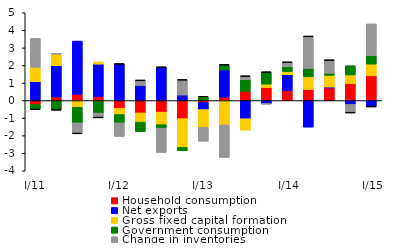
| Category | Household consumption | Net exports | Gross fixed capital formation  | Government consumption | Change in inventories | NPISH expenditure |
|---|---|---|---|---|---|---|
| I/11 | -0.225 | 1.077 | 0.82 | -0.274 | 1.644 | -0.012 |
| II | 0.202 | 1.787 | 0.65 | -0.531 | 0.049 | -0.008 |
| III | 0.358 | 3.03 | -0.383 | -0.89 | -0.597 | -0.009 |
| IV | 0.229 | 1.848 | 0.122 | -0.717 | -0.246 | -0.007 |
| I/12 | -0.443 | 2.081 | -0.353 | -0.471 | -0.775 | 0.008 |
| II | -0.705 | 0.864 | -0.522 | -0.54 | 0.283 | 0.005 |
| III | -0.655 | 1.896 | -0.717 | -0.197 | -1.39 | 0.015 |
| IV | -1.029 | 0.314 | -1.64 | -0.195 | 0.855 | 0.023 |
| I/13 | -0.111 | -0.402 | -1.015 | 0.211 | -0.791 | 0.029 |
| II | 0.193 | 1.554 | -1.387 | 0.279 | -1.854 | 0.027 |
| III | 0.525 | -1.035 | -0.649 | 0.658 | 0.195 | 0.028 |
|  IV | 0.741 | -0.187 | 0.196 | 0.672 | -0.01 | 0.025 |
|  I/14 | 0.561 | 0.914 | 0.178 | 0.278 | 0.248 | 0.011 |
| II | 0.627 | -1.512 | 0.725 | 0.481 | 1.816 | 0.01 |
| III | 0.714 | 0.055 | 0.666 | 0.125 | 0.74 | 0.004 |
| IV | 0.971 | -0.222 | 0.486 | 0.53 | -0.469 | -0.003 |
|  I/15 | 1.407 | -0.348 | 0.67 | 0.48 | 1.81 | 0 |